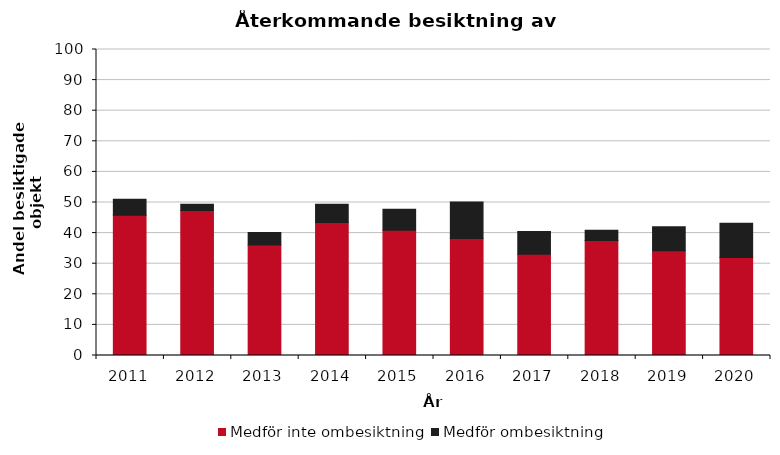
| Category | Medför inte ombesiktning | Medför ombesiktning |
|---|---|---|
| 2011.0 | 45.8 | 5.3 |
| 2012.0 | 47.4 | 2 |
| 2013.0 | 36.1 | 4.1 |
| 2014.0 | 43.5 | 5.9 |
| 2015.0 | 40.9 | 6.9 |
| 2016.0 | 38.2 | 12 |
| 2017.0 | 33.1 | 7.4 |
| 2018.0 | 37.6 | 3.3 |
| 2019.0 | 34.2 | 7.9 |
| 2020.0 | 32 | 11.2 |